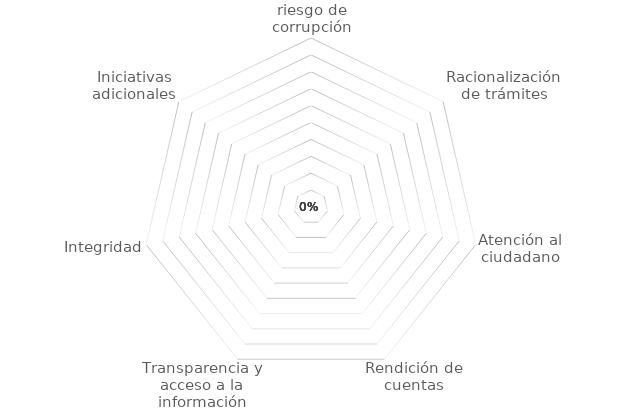
| Category | Series 0 |
|---|---|
| Gestión del riesgo de corrupción | 0 |
| Racionalización de trámites | 0 |
| Atención al ciudadano | 0 |
| Rendición de cuentas | 0 |
| Transparencia y acceso a la información | 0 |
| Integridad | 0 |
| Iniciativas adicionales | 0 |